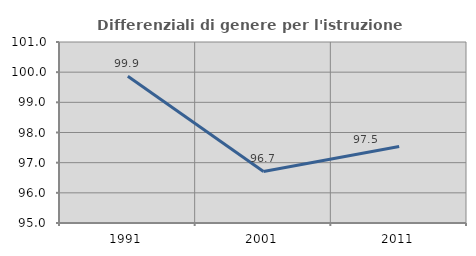
| Category | Differenziali di genere per l'istruzione superiore |
|---|---|
| 1991.0 | 99.867 |
| 2001.0 | 96.71 |
| 2011.0 | 97.535 |